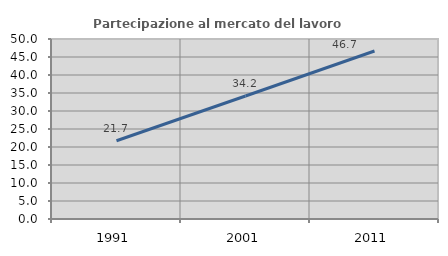
| Category | Partecipazione al mercato del lavoro  femminile |
|---|---|
| 1991.0 | 21.739 |
| 2001.0 | 34.167 |
| 2011.0 | 46.667 |